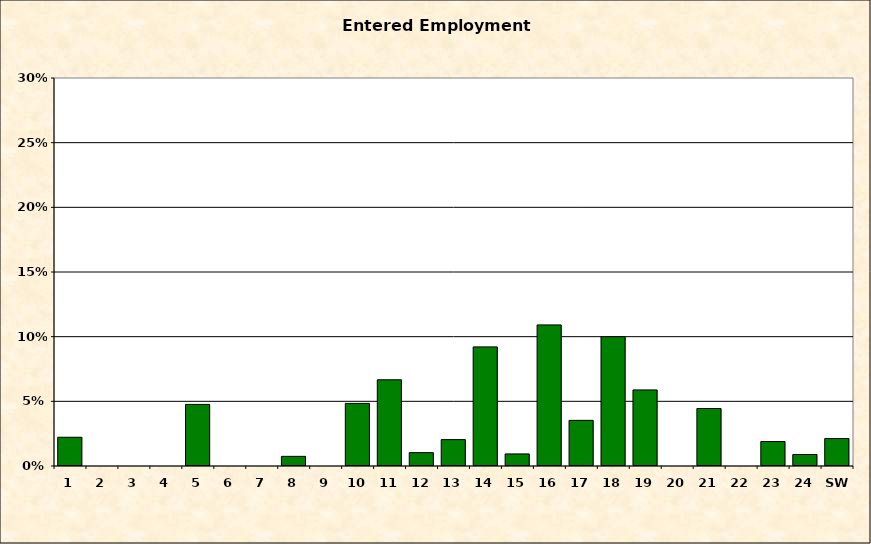
| Category | Entered Employment Rate |
|---|---|
| 1 | 0.022 |
| 2 | 0 |
| 3 | 0 |
| 4 | 0 |
| 5 | 0.048 |
| 6 | 0 |
| 7 | 0 |
| 8 | 0.007 |
| 9 | 0 |
| 10 | 0.048 |
| 11 | 0.067 |
| 12 | 0.01 |
| 13 | 0.02 |
| 14 | 0.092 |
| 15 | 0.009 |
| 16 | 0.109 |
| 17 | 0.035 |
| 18 | 0.1 |
| 19 | 0.059 |
| 20 | 0 |
| 21 | 0.044 |
| 22 | 0 |
| 23 | 0.019 |
| 24 | 0.009 |
| SW | 0.021 |